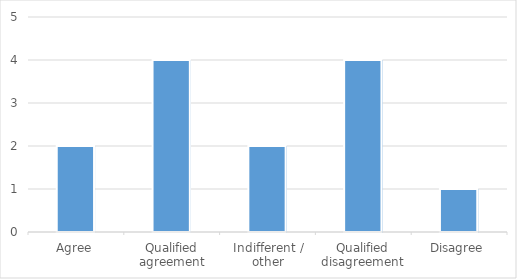
| Category | Series 0 |
|---|---|
| Agree | 2 |
| Qualified agreement | 4 |
| Indifferent / other | 2 |
| Qualified disagreement | 4 |
| Disagree | 1 |